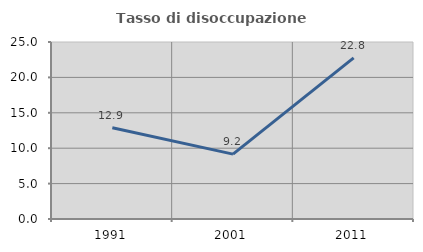
| Category | Tasso di disoccupazione giovanile  |
|---|---|
| 1991.0 | 12.885 |
| 2001.0 | 9.16 |
| 2011.0 | 22.768 |